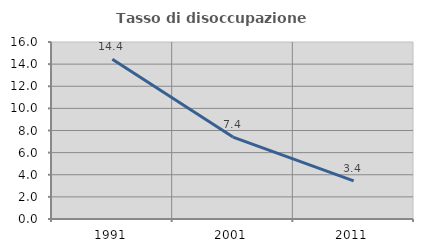
| Category | Tasso di disoccupazione giovanile  |
|---|---|
| 1991.0 | 14.433 |
| 2001.0 | 7.407 |
| 2011.0 | 3.448 |